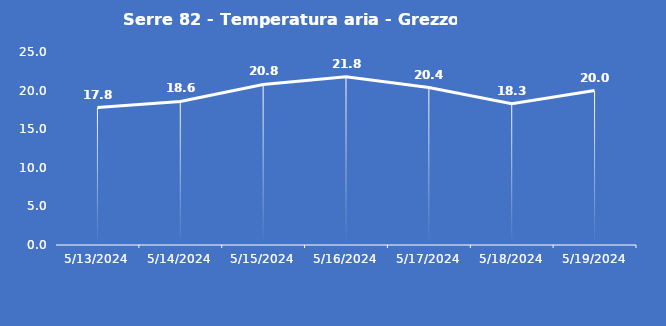
| Category | Serre 82 - Temperatura aria - Grezzo (°C) |
|---|---|
| 5/13/24 | 17.8 |
| 5/14/24 | 18.6 |
| 5/15/24 | 20.8 |
| 5/16/24 | 21.8 |
| 5/17/24 | 20.4 |
| 5/18/24 | 18.3 |
| 5/19/24 | 20 |